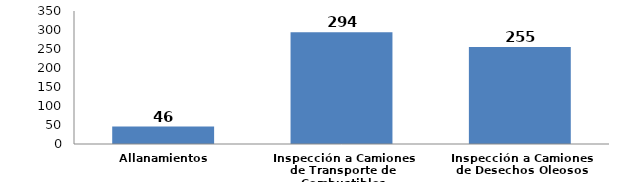
| Category | Series 0 |
|---|---|
| Allanamientos | 46 |
| Inspección a Camiones de Transporte de Combustibles | 294 |
| Inspección a Camiones de Desechos Oleosos | 255 |